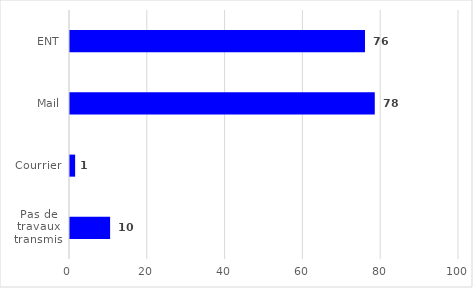
| Category | Series 0 |
|---|---|
| ENT | 75.83 |
| Mail | 78.35 |
| Courrier | 1.32 |
| Pas de travaux transmis | 10.31 |